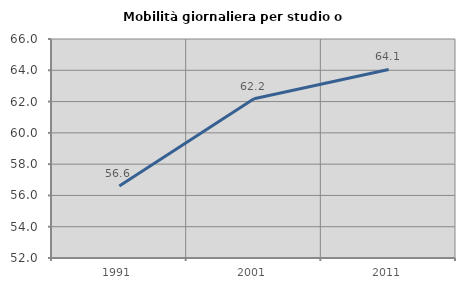
| Category | Mobilità giornaliera per studio o lavoro |
|---|---|
| 1991.0 | 56.61 |
| 2001.0 | 62.178 |
| 2011.0 | 64.055 |